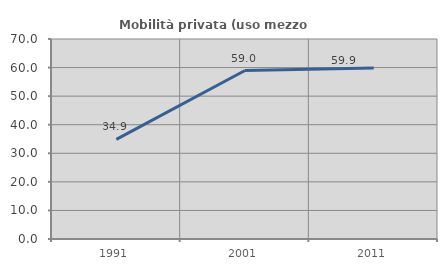
| Category | Mobilità privata (uso mezzo privato) |
|---|---|
| 1991.0 | 34.862 |
| 2001.0 | 58.962 |
| 2011.0 | 59.887 |